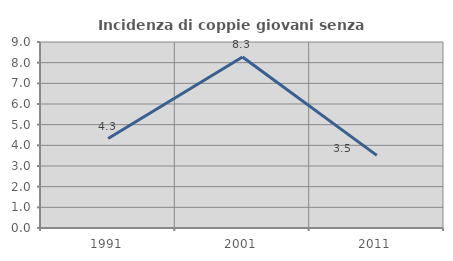
| Category | Incidenza di coppie giovani senza figli |
|---|---|
| 1991.0 | 4.329 |
| 2001.0 | 8.271 |
| 2011.0 | 3.516 |